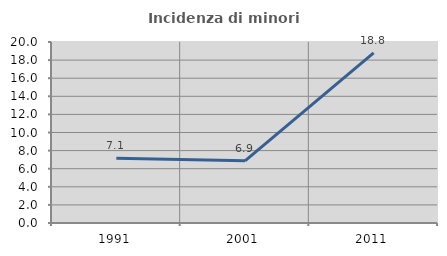
| Category | Incidenza di minori stranieri |
|---|---|
| 1991.0 | 7.143 |
| 2001.0 | 6.87 |
| 2011.0 | 18.788 |